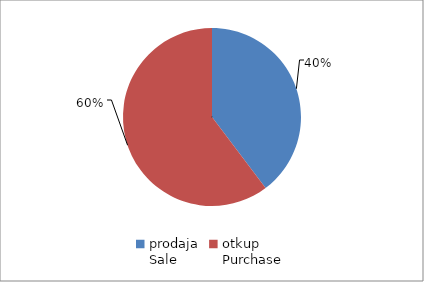
| Category | Series 0 |
|---|---|
| prodaja
Sale | 9291675.4 |
| otkup
Purchase | 14104049.3 |